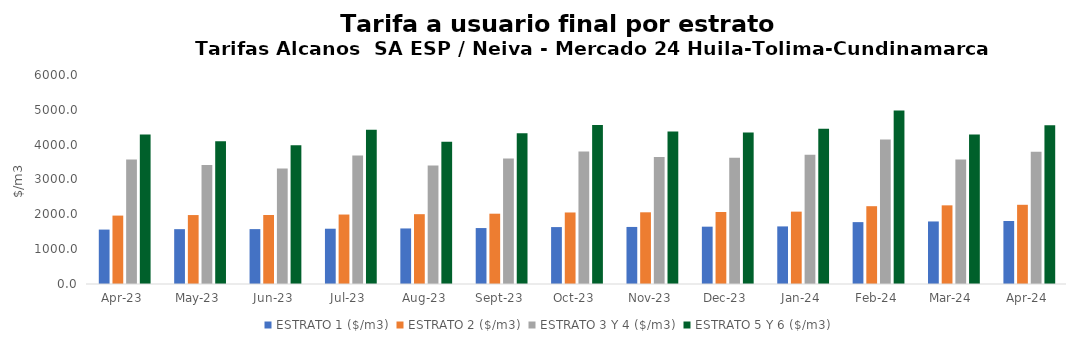
| Category | ESTRATO 1 ($/m3) | ESTRATO 2 ($/m3) | ESTRATO 3 Y 4 ($/m3) | ESTRATO 5 Y 6 ($/m3) |
|---|---|---|---|---|
| 2023-04-01 | 1562.23 | 1963.79 | 3575.22 | 4290.264 |
| 2023-05-01 | 1574.25 | 1979.21 | 3416.65 | 4099.98 |
| 2023-06-01 | 1575.71 | 1980.83 | 3316.57 | 3979.884 |
| 2023-07-01 | 1586.9 | 1994.23 | 3689.81 | 4427.772 |
| 2023-08-01 | 1594.84 | 2004.4 | 3401.48 | 4081.776 |
| 2023-09-01 | 1606 | 2018.25 | 3603.59 | 4324.308 |
| 2023-10-01 | 1634.07 | 2053.24 | 3805.44 | 4566.528 |
| 2023-11-01 | 1638.05 | 2058.35 | 3648.51 | 4378.212 |
| 2023-12-01 | 1645.74 | 2067.85 | 3624.28 | 4349.136 |
| 2024-01-01 | 1653.34 | 2077.37 | 3712.73 | 4455.276 |
| 2024-02-01 | 1776.31 | 2233.64 | 4149.96 | 4979.952 |
| 2024-03-01 | 1795.46 | 2257.96 | 3575.59 | 4290.708 |
| 2024-04-01 | 1808.39 | 2273.82 | 3795.47 | 4554.564 |